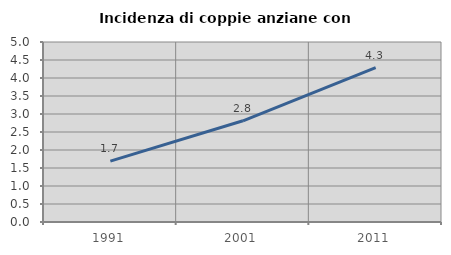
| Category | Incidenza di coppie anziane con figli |
|---|---|
| 1991.0 | 1.691 |
| 2001.0 | 2.811 |
| 2011.0 | 4.288 |